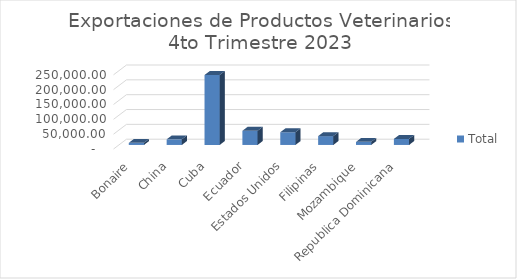
| Category | Total |
|---|---|
| Bonaire | 7166.8 |
| China | 18876.31 |
| Cuba | 235662.86 |
| Ecuador | 47840 |
| Estados Unidos | 42827.85 |
| Filipinas | 29765 |
| Mozambique | 10450 |
| Republica Dominicana | 20305.59 |